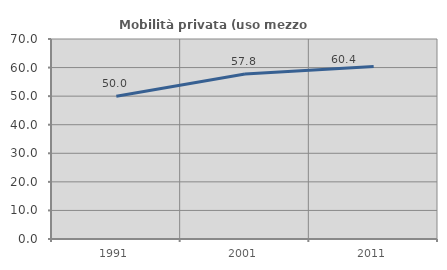
| Category | Mobilità privata (uso mezzo privato) |
|---|---|
| 1991.0 | 49.956 |
| 2001.0 | 57.751 |
| 2011.0 | 60.407 |